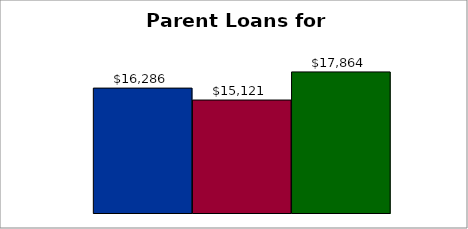
| Category | 50 states and D.C. | SREB states | State |
|---|---|---|---|
| 0 | 16285.69 | 15120.748 | 17863.615 |